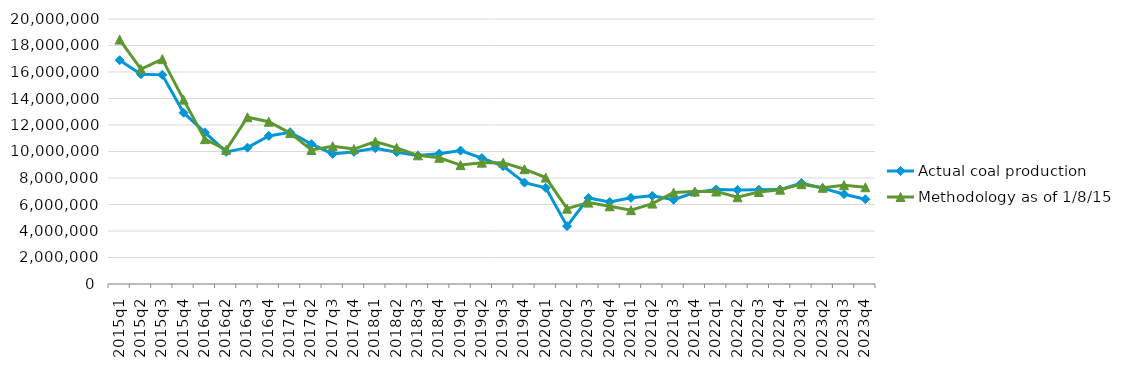
| Category | Actual coal production | Methodology as of 1/8/15 |
|---|---|---|
| 2015q1 | 16889338 | 18443493 |
| 2015q2 | 15831469 | 16219801 |
| 2015q3 | 15783695 | 16971825 |
| 2015q4 | 12929112 | 13913471 |
| 2016q1 | 11442166 | 10931890 |
| 2016q2 | 9971434 | 10123385 |
| 2016q3 | 10289832 | 12586331 |
| 2016q4 | 11177509 | 12245255 |
| 2017q1 | 11455047 | 11388192 |
| 2017q2 | 10557451 | 10112686 |
| 2017q3 | 9819936 | 10395387 |
| 2017q4 | 9974781 | 10182808 |
| 2018q1 | 10251154 | 10753609 |
| 2018q2 | 9949790 | 10277662 |
| 2018q3 | 9701334 | 9711770 |
| 2018q4 | 9837884 | 9522735 |
| 2019q1 | 10066319 | 8973903 |
| 2019q2 | 9502509 | 9158315 |
| 2019q3 | 8892294 | 9155866 |
| 2019q4 | 7650301 | 8664034 |
| 2020q1 | 7261173 | 8030886 |
| 2020q2 | 4368147 | 5688497 |
| 2020q3 | 6492788 | 6142419 |
| 2020q4 | 6183753 | 5862721 |
| 2021q1 | 6501069 | 5572243 |
| 2021q2 | 6650709 | 6070171 |
| 2021q3 | 6357026 | 6898836 |
| 2021q4 | 6916983 | 6975800 |
| 2022q1 | 7137285 | 6982487 |
| 2022q2 | 7097553 | 6549908 |
| 2022q3 | 7117163 | 6944831 |
| 2022q4 | 7125369 | 7120332 |
| 2023q1 | 7618266 | 7535247 |
| 2023q2 | 7232796 | 7266447 |
| 2023q3 | 6778791 | 7456960 |
| 2023q4 | 6397103 | 7301387 |